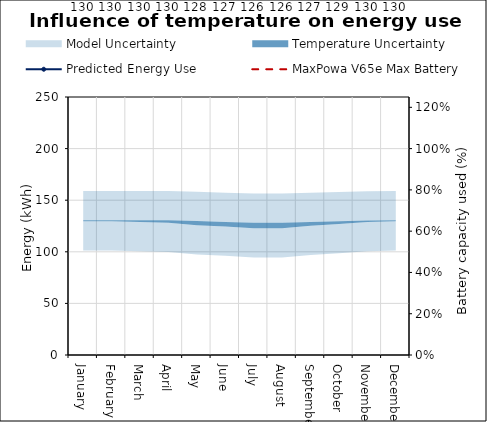
| Category | Predicted Energy Use | MaxPowa V65e Max Battery |
|---|---|---|
| 0 | 130.334 | 200 |
| 1 | 130.334 | 200 |
| 2 | 130.026 | 200 |
| 3 | 129.62 | 200 |
| 4 | 128.294 | 200 |
| 5 | 127.022 | 200 |
| 6 | 125.81 | 200 |
| 7 | 125.81 | 200 |
| 8 | 127.298 | 200 |
| 9 | 128.516 | 200 |
| 10 | 129.766 | 200 |
| 11 | 130.242 | 200 |